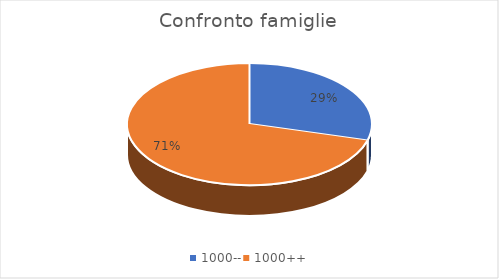
| Category | Series 0 |
|---|---|
| 1000-- | 240 |
| 1000++ | 578 |